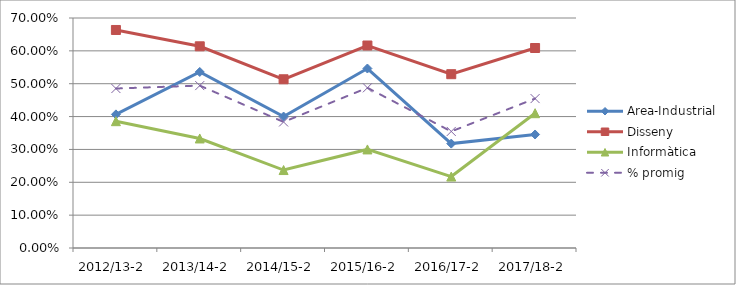
| Category | Area-Industrial | Disseny | Informàtica | % promig |
|---|---|---|---|---|
| 2012/13-2 | 0.407 | 0.664 | 0.386 | 0.485 |
| 2013/14-2 | 0.536 | 0.614 | 0.333 | 0.494 |
| 2014/15-2 | 0.4 | 0.514 | 0.237 | 0.384 |
| 2015/16-2 | 0.546 | 0.616 | 0.3 | 0.487 |
| 2016/17-2 | 0.318 | 0.529 | 0.217 | 0.355 |
| 2017/18-2 | 0.345 | 0.609 | 0.41 | 0.455 |